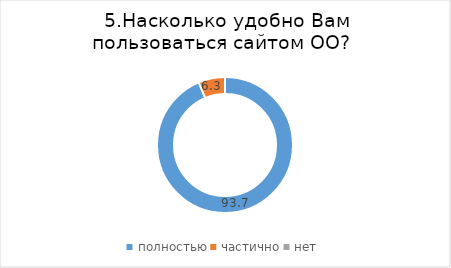
| Category | Series 0 |
|---|---|
| полностью | 93.678 |
| частично | 6.322 |
| нет | 0 |